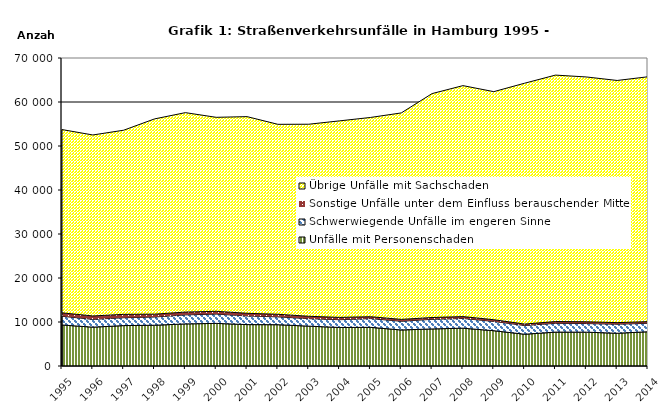
| Category | Unfälle mit Personenschaden | Schwerwiegende Unfälle im engeren Sinne | Sonstige Unfälle unter dem Einfluss berauschender Mittel 1) | Übrige Unfälle mit Sachschaden |
|---|---|---|---|---|
| 1995.0 | 9323 | 1981 | 775 | 41654 |
| 1996.0 | 8827 | 1775 | 772 | 41133 |
| 1997.0 | 9186 | 1789 | 763 | 41852 |
| 1998.0 | 9264 | 1869 | 648 | 44374 |
| 1999.0 | 9566 | 2055 | 634 | 45326 |
| 2000.0 | 9684 | 2114 | 632 | 44087 |
| 2001.0 | 9410 | 1972 | 596 | 44696 |
| 2002.0 | 9383 | 1782 | 592 | 43169 |
| 2003.0 | 9058 | 1702 | 542 | 43646 |
| 2004.0 | 8755 | 1770 | 513 | 44673 |
| 2005.0 | 8788 | 1991 | 422 | 45281 |
| 2006.0 | 8190 | 1977 | 424 | 46926 |
| 2007.0 | 8426 | 2186 | 404 | 50897 |
| 2008.0 | 8594 | 2206 | 432 | 52488 |
| 2009.0 | 8022 | 2115 | 380 | 51835 |
| 2010.0 | 7217 | 1987 | 324 | 54741 |
| 2011.0 | 7704 | 2003 | 394 | 56014 |
| 2012.0 | 7691 | 1958 | 401 | 55640 |
| 2013.0 | 7443 | 2059 | 355 | 55040 |
| 2014.0 | 7787 | 1921 | 380 | 55646 |